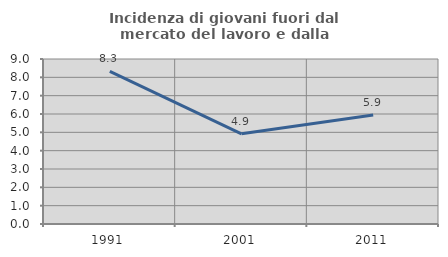
| Category | Incidenza di giovani fuori dal mercato del lavoro e dalla formazione  |
|---|---|
| 1991.0 | 8.325 |
| 2001.0 | 4.918 |
| 2011.0 | 5.941 |